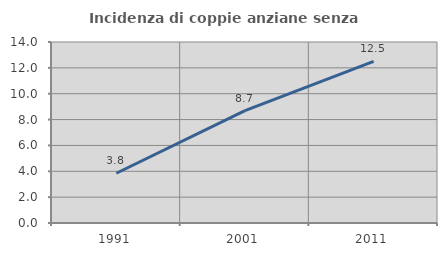
| Category | Incidenza di coppie anziane senza figli  |
|---|---|
| 1991.0 | 3.846 |
| 2001.0 | 8.696 |
| 2011.0 | 12.5 |